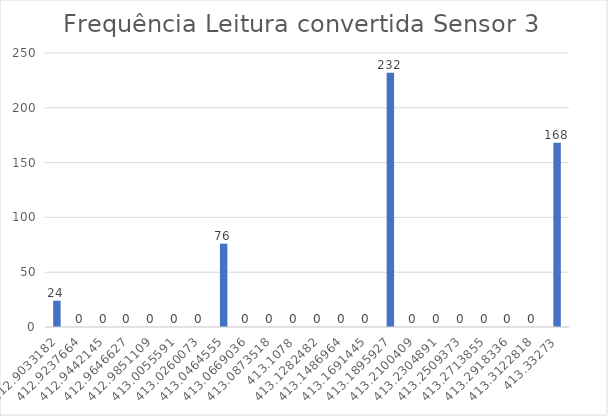
| Category | Series 0 |
|---|---|
| 412.90331818181824 | 24 |
| 412.9237663636364 | 0 |
| 412.94421454545454 | 0 |
| 412.96466272727275 | 0 |
| 412.98511090909096 | 0 |
| 413.0055590909091 | 0 |
| 413.02600727272727 | 0 |
| 413.0464554545455 | 76 |
| 413.0669036363637 | 0 |
| 413.08735181818184 | 0 |
| 413.1078 | 0 |
| 413.1282481818182 | 0 |
| 413.1486963636364 | 0 |
| 413.16914454545457 | 0 |
| 413.1895927272727 | 232 |
| 413.21004090909094 | 0 |
| 413.23048909090915 | 0 |
| 413.2509372727273 | 0 |
| 413.27138545454545 | 0 |
| 413.29183363636366 | 0 |
| 413.3122818181819 | 0 |
| 413.33273 | 168 |